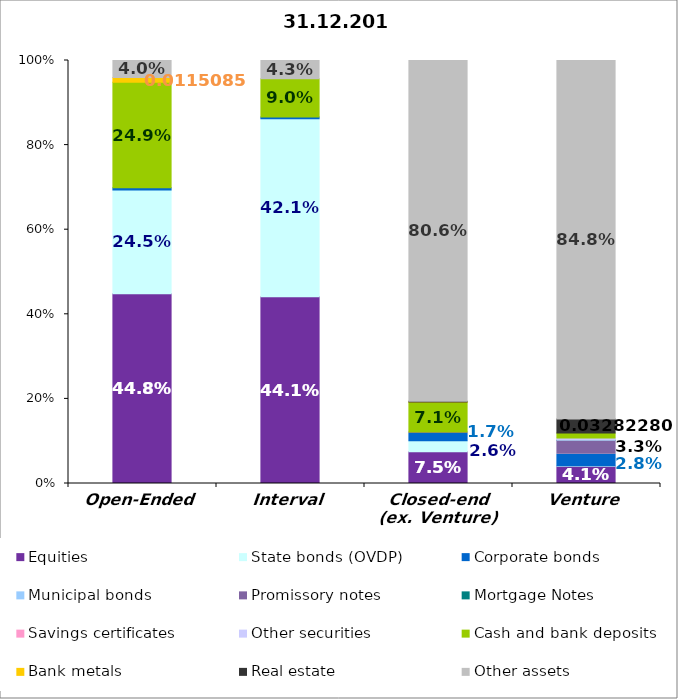
| Category | Equities | State bonds (OVDP) | Corporate bonds | Municipal bonds | Promissory notes | Mortgage Notes | Savings certificates | Other securities | Cash and bank deposits | Bank metals | Real estate | Other assets |
|---|---|---|---|---|---|---|---|---|---|---|---|---|
| Open-Ended | 0.448 | 0.245 | 0.005 | 0 | 0 | 0 | 0 | 0 | 0.249 | 0.012 | 0 | 0.04 |
| Interval | 0.441 | 0.421 | 0.004 | 0 | 0 | 0 | 0 | 0 | 0.09 | 0 | 0 | 0.043 |
| Closed-end (ex. Venture) | 0.075 | 0.026 | 0.017 | 0 | 0.004 | 0 | 0 | 0 | 0.071 | 0 | 0.002 | 0.806 |
| Venture | 0.041 | 0.001 | 0.028 | 0 | 0.033 | 0 | 0 | 0.005 | 0.012 | 0 | 0.033 | 0.848 |